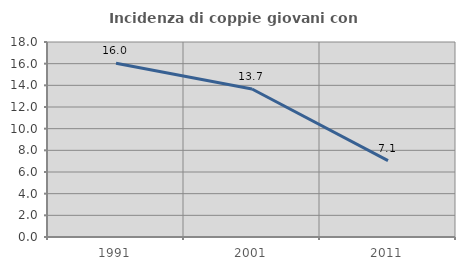
| Category | Incidenza di coppie giovani con figli |
|---|---|
| 1991.0 | 16.034 |
| 2001.0 | 13.665 |
| 2011.0 | 7.055 |